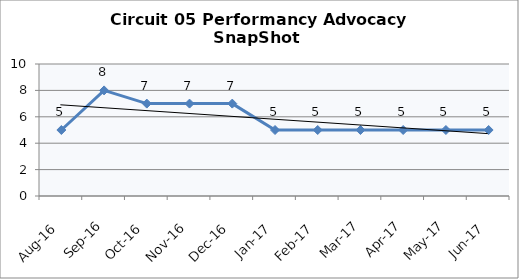
| Category | Circuit 05 |
|---|---|
| Aug-16 | 5 |
| Sep-16 | 8 |
| Oct-16 | 7 |
| Nov-16 | 7 |
| Dec-16 | 7 |
| Jan-17 | 5 |
| Feb-17 | 5 |
| Mar-17 | 5 |
| Apr-17 | 5 |
| May-17 | 5 |
| Jun-17 | 5 |